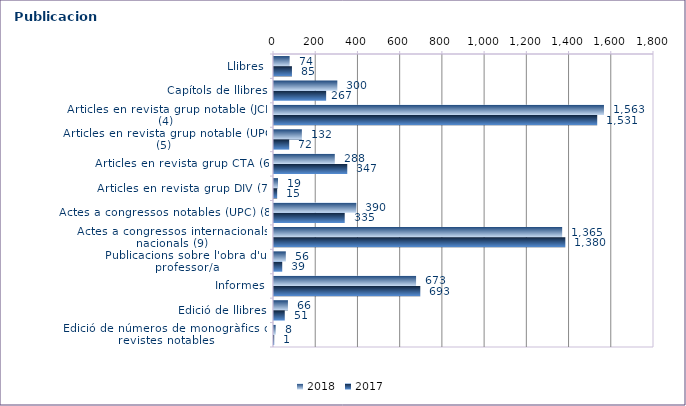
| Category | 2018 | 2017 |
|---|---|---|
| Llibres | 74 | 85 |
| Capítols de llibres | 300 | 247 |
| Articles en revista grup notable (JCR) (4) | 1563 | 1531 |
| Articles en revista grup notable (UPC) (5) | 132 | 72 |
| Articles en revista grup CTA (6) | 288 | 347 |
| Articles en revista grup DIV (7) | 19 | 15 |
| Actes a congressos notables (UPC) (8) | 390 | 335 |
| Actes a congressos internacionals i nacionals (9) | 1365 | 1380 |
| Publicacions sobre l'obra d'un professor/a | 56 | 39 |
| Informes | 673 | 693 |
| Edició de llibres | 66 | 51 |
| Edició de números de monogràfics de revistes notables | 8 | 1 |